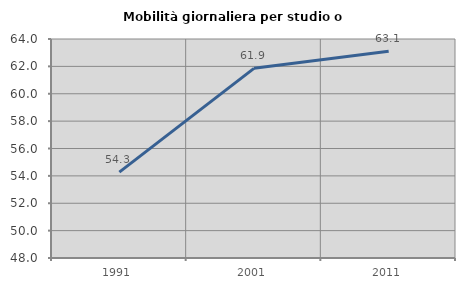
| Category | Mobilità giornaliera per studio o lavoro |
|---|---|
| 1991.0 | 54.274 |
| 2001.0 | 61.858 |
| 2011.0 | 63.102 |